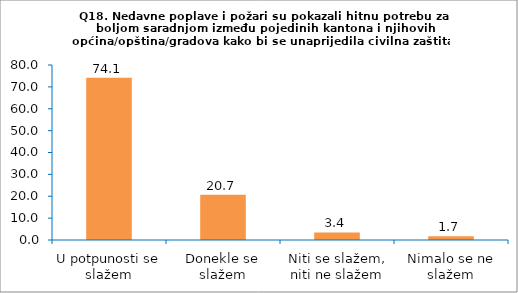
| Category | Series 0 |
|---|---|
| U potpunosti se slažem | 74.138 |
| Donekle se slažem | 20.69 |
| Niti se slažem, niti ne slažem | 3.448 |
| Nimalo se ne slažem | 1.724 |